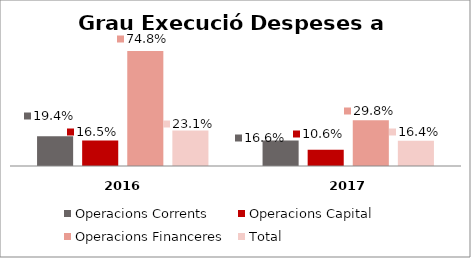
| Category | Operacions Corrents | Operacions Capital | Operacions Financeres | Total |
|---|---|---|---|---|
| 0 | 0.194 | 0.165 | 0.748 | 0.231 |
| 1 | 0.166 | 0.106 | 0.298 | 0.164 |